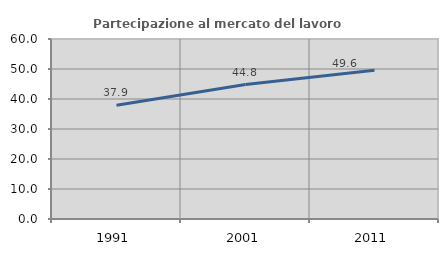
| Category | Partecipazione al mercato del lavoro  femminile |
|---|---|
| 1991.0 | 37.887 |
| 2001.0 | 44.808 |
| 2011.0 | 49.574 |